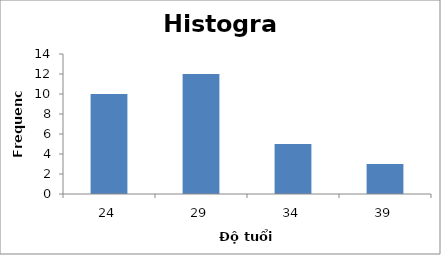
| Category | Series 0 |
|---|---|
| 24.0 | 10 |
| 29.0 | 12 |
| 34.0 | 5 |
| 39.0 | 3 |